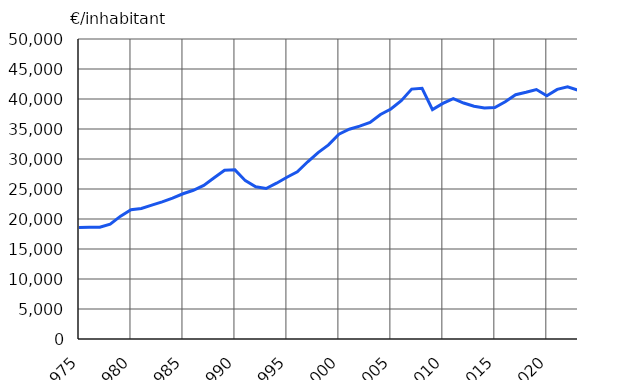
| Category | €/inhabitant |
|---|---|
| 1975 | 18576 |
| 1976 | 18613 |
| 1977 | 18621 |
| 1978 | 19152 |
| 1979 | 20475 |
| 1980 | 21561 |
| 1981 | 21751 |
| 1982 | 22302 |
| 1983 | 22860 |
| 1984 | 23475 |
| 1985 | 24207 |
| 1986 | 24793 |
| 1987 | 25607 |
| 1988 | 26864 |
| 1989 | 28129 |
| 1990 | 28193 |
| 1991 | 26389 |
| 1992 | 25376 |
| 1993 | 25087 |
| 1994 | 25969 |
| 1995 | 26961 |
| 1996 | 27858 |
| 1997 | 29535 |
| 1998 | 31064 |
| 1999 | 32349 |
| 2000 | 34145 |
| 2001 | 34957 |
| 2002 | 35468 |
| 2003 | 36092 |
| 2004 | 37424 |
| 2005 | 38333 |
| 2006 | 39724 |
| 2007 | 41652 |
| 2008 | 41783 |
| 2009 | 38226 |
| 2010 | 39263 |
| 2011 | 40078 |
| 2012 | 39330 |
| 2013 | 38796 |
| 2014 | 38488 |
| 2015 | 38570 |
| 2016 | 39548 |
| 2017 | 40715 |
| 2018 | 41119 |
| 2019 | 41582 |
| 2020 | 40536 |
| 2021 | 41605 |
| 2022* | 42044 |
| 2023* | 41456 |